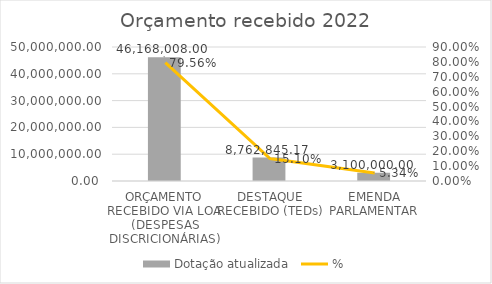
| Category | Dotação atualizada |
|---|---|
| ORÇAMENTO RECEBIDO VIA LOA (DESPESAS DISCRICIONÁRIAS) | 46168008 |
| DESTAQUE RECEBIDO (TEDs) | 8762845.17 |
| EMENDA PARLAMENTAR | 3100000 |